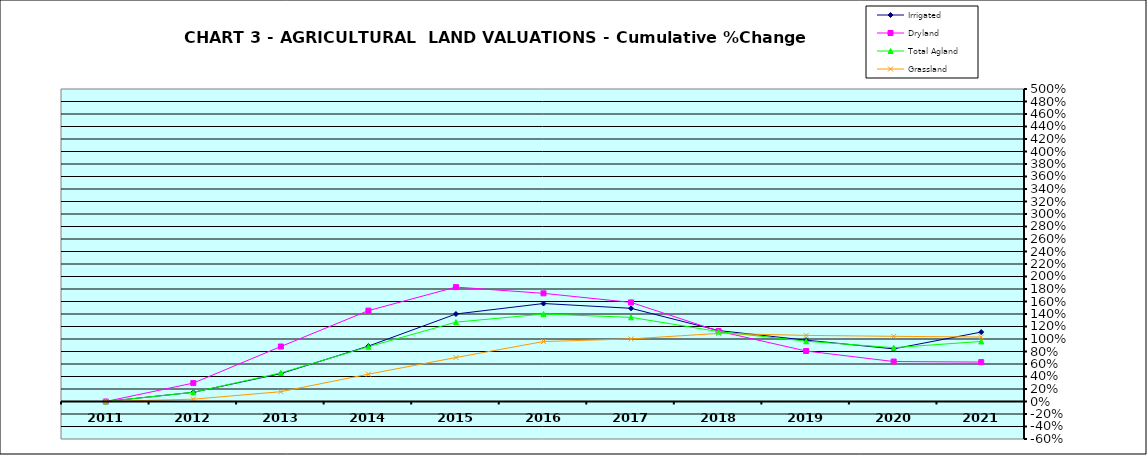
| Category | Irrigated | Dryland | Total Agland | Grassland |
|---|---|---|---|---|
| 2011.0 | 0 | 0 | 0 | 0 |
| 2012.0 | 0.147 | 0.295 | 0.147 | 0.037 |
| 2013.0 | 0.447 | 0.88 | 0.458 | 0.157 |
| 2014.0 | 0.886 | 1.454 | 0.876 | 0.437 |
| 2015.0 | 1.4 | 1.83 | 1.269 | 0.704 |
| 2016.0 | 1.568 | 1.731 | 1.399 | 0.959 |
| 2017.0 | 1.491 | 1.586 | 1.346 | 1.002 |
| 2018.0 | 1.135 | 1.125 | 1.118 | 1.089 |
| 2019.0 | 0.981 | 0.808 | 0.965 | 1.058 |
| 2020.0 | 0.842 | 0.64 | 0.861 | 1.043 |
| 2021.0 | 1.111 | 0.631 | 0.961 | 1.031 |